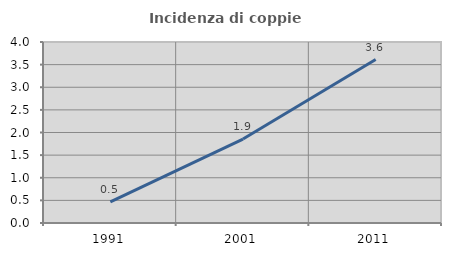
| Category | Incidenza di coppie miste |
|---|---|
| 1991.0 | 0.465 |
| 2001.0 | 1.855 |
| 2011.0 | 3.613 |